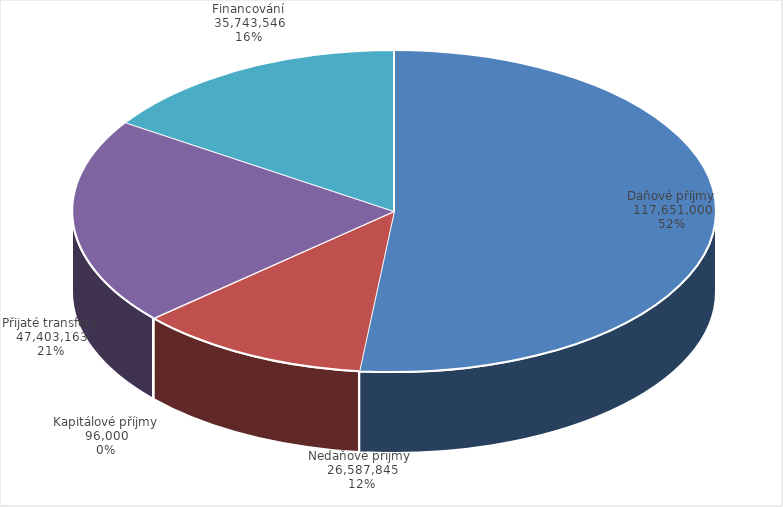
| Category | Series 0 |
|---|---|
| Daňové příjmy | 117651000 |
| Nedaňové příjmy  | 26587845 |
| Kapitálové příjmy | 96000 |
| Přijaté transfery | 47403163 |
| Financování | 35743546 |